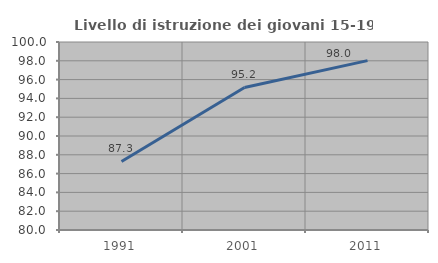
| Category | Livello di istruzione dei giovani 15-19 anni |
|---|---|
| 1991.0 | 87.288 |
| 2001.0 | 95.161 |
| 2011.0 | 98.02 |